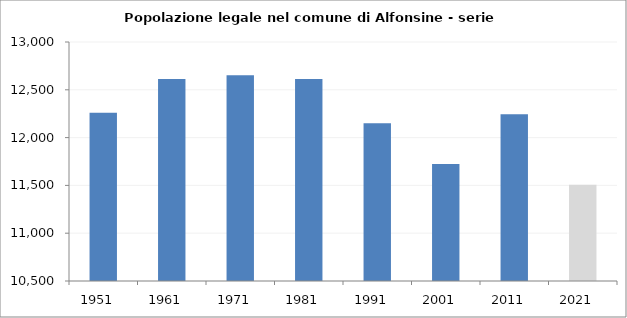
| Category | Popolazione legale |
|---|---|
| 1951   | 12259 |
| 1961   | 12612 |
| 1971   | 12651 |
| 1981   | 12612 |
| 1991   | 12151 |
| 2001   | 11724 |
| 2011   | 12245 |
| 2021   | 11506 |